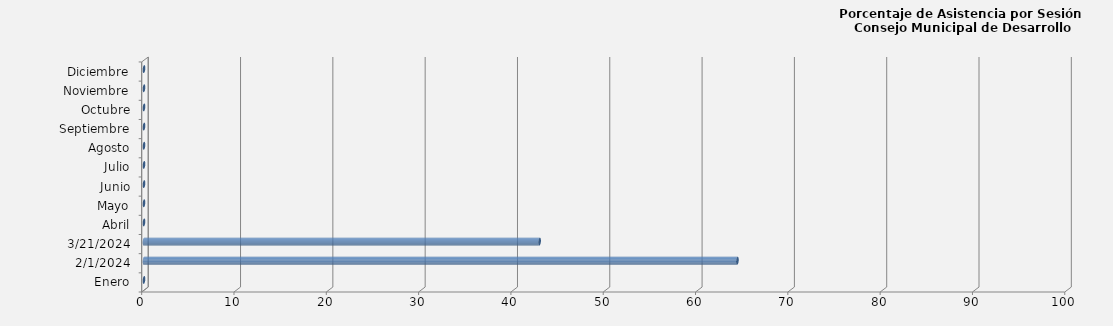
| Category | Series 0 |
|---|---|
| Enero | 0 |
| 01/02/2024 | 64.286 |
| 21/03/2024 | 42.857 |
| Abril | 0 |
| Mayo | 0 |
| Junio | 0 |
| Julio | 0 |
| Agosto | 0 |
| Septiembre | 0 |
| Octubre | 0 |
| Noviembre | 0 |
| Diciembre | 0 |